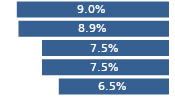
| Category | Series 0 |
|---|---|
|  Michigan  | 0.09 |
|  Illinois  | 0.089 |
|  Ohio  | 0.075 |
|  Indiana  | 0.075 |
|  Missouri  | 0.065 |